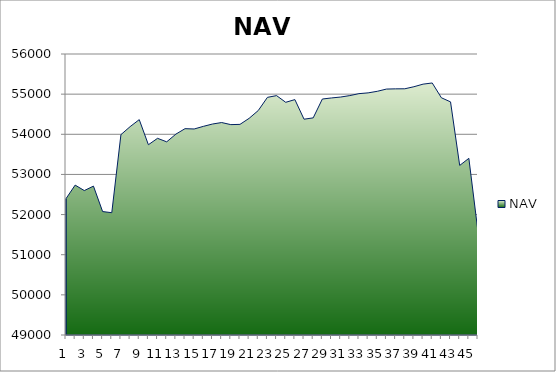
| Category | NAV |
|---|---|
| 0 | 52397 |
| 1 | 52733.957 |
| 2 | 52597.875 |
| 3 | 52708.772 |
| 4 | 52075.184 |
| 5 | 52046.775 |
| 6 | 53991.219 |
| 7 | 54189.909 |
| 8 | 54364.909 |
| 9 | 53739.909 |
| 10 | 53899.542 |
| 11 | 53812.294 |
| 12 | 54003.961 |
| 13 | 54140.037 |
| 14 | 54132.37 |
| 15 | 54197.37 |
| 16 | 54255.812 |
| 17 | 54292.622 |
| 18 | 54240.699 |
| 19 | 54246.834 |
| 20 | 54397.391 |
| 21 | 54592.197 |
| 22 | 54920.119 |
| 23 | 54963.245 |
| 24 | 54796.799 |
| 25 | 54863.963 |
| 26 | 54375.975 |
| 27 | 54409.015 |
| 28 | 54878.402 |
| 29 | 54905.151 |
| 30 | 54927.958 |
| 31 | 54964.157 |
| 32 | 55012.385 |
| 33 | 55031.616 |
| 34 | 55070.791 |
| 35 | 55126.461 |
| 36 | 55131.71 |
| 37 | 55133.391 |
| 38 | 55184.783 |
| 39 | 55249.119 |
| 40 | 55278.196 |
| 41 | 54909.993 |
| 42 | 54807.052 |
| 43 | 53224.092 |
| 44 | 53401.214 |
| 45 | 51567.133 |